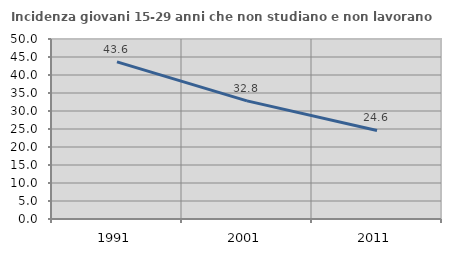
| Category | Incidenza giovani 15-29 anni che non studiano e non lavorano  |
|---|---|
| 1991.0 | 43.629 |
| 2001.0 | 32.822 |
| 2011.0 | 24.606 |